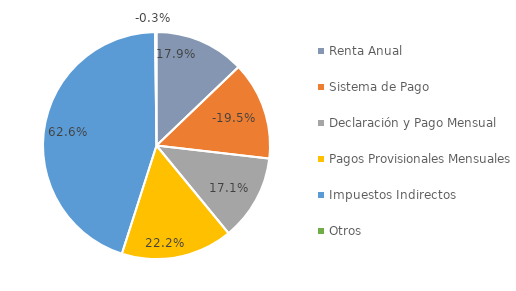
| Category | Series 0 |
|---|---|
| Renta Anual | 0.179 |
| Sistema de Pago | -0.195 |
| Declaración y Pago Mensual | 0.171 |
| Pagos Provisionales Mensuales | 0.222 |
| Impuestos Indirectos | 0.626 |
| Otros | -0.003 |